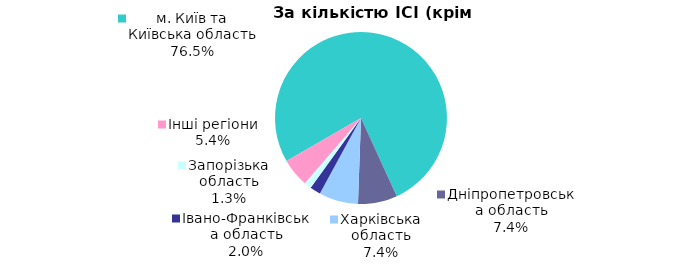
| Category | Series 0 |
|---|---|
| м. Київ та Київська область | 0.765 |
| Дніпропетровська область | 0.074 |
| Харківська область | 0.074 |
| Iвано-Франкiвська область | 0.02 |
| Запорізька область | 0.013 |
| Інші регіони | 0.054 |